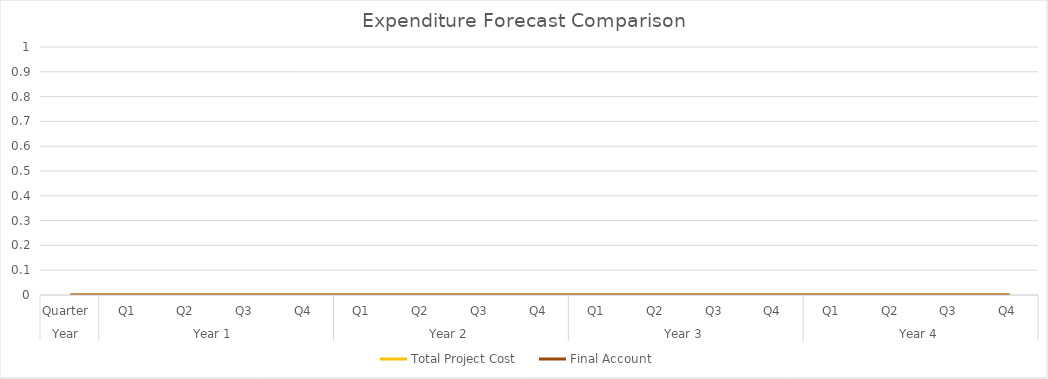
| Category | Total Project Cost | Final Account |
|---|---|---|
| 0 | 0 | 0 |
| 1 | 0 | 0 |
| 2 | 0 | 0 |
| 3 | 0 | 0 |
| 4 | 0 | 0 |
| 5 | 0 | 0 |
| 6 | 0 | 0 |
| 7 | 0 | 0 |
| 8 | 0 | 0 |
| 9 | 0 | 0 |
| 10 | 0 | 0 |
| 11 | 0 | 0 |
| 12 | 0 | 0 |
| 13 | 0 | 0 |
| 14 | 0 | 0 |
| 15 | 0 | 0 |
| 16 | 0 | 0 |